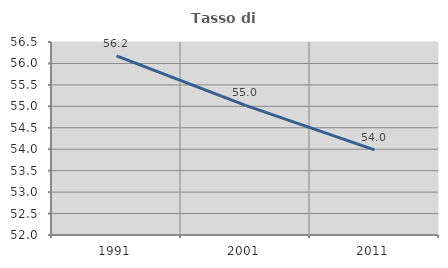
| Category | Tasso di occupazione   |
|---|---|
| 1991.0 | 56.176 |
| 2001.0 | 55.024 |
| 2011.0 | 53.985 |